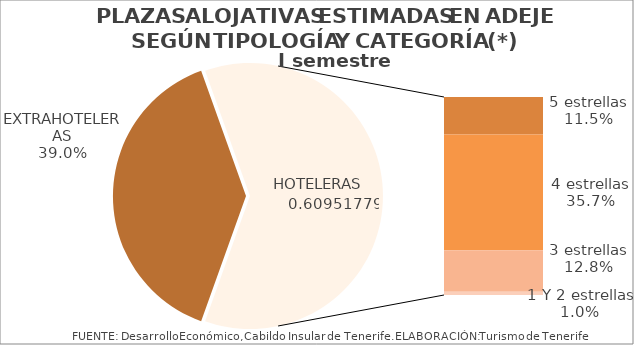
| Category | I semestre 2014 |
|---|---|
| EXTRAHOTELERAS | 0.39 |
| 5 estrellas | 0.115 |
| 4 estrellas | 0.357 |
| 3 estrellas | 0.128 |
| 1 Y 2 estrellas | 0.01 |